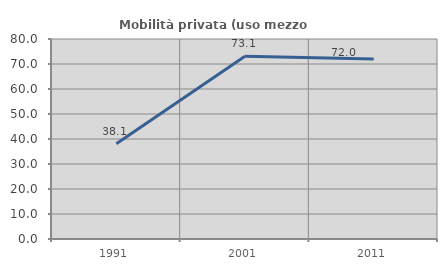
| Category | Mobilità privata (uso mezzo privato) |
|---|---|
| 1991.0 | 38.095 |
| 2001.0 | 73.118 |
| 2011.0 | 72 |